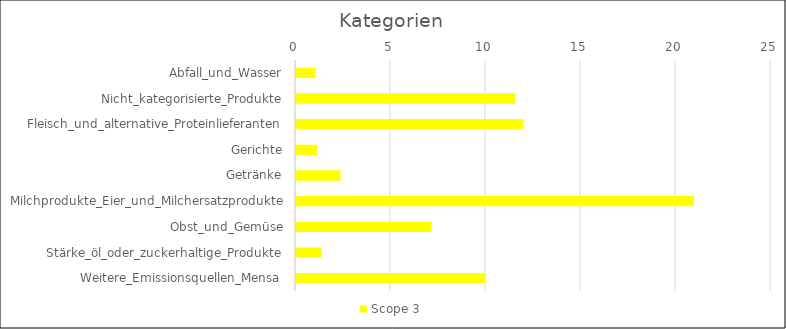
| Category | Scope 3 |
|---|---|
| Abfall_und_Wasser | 1.091 |
| Nicht_kategorisierte_Produkte | 11.6 |
| Fleisch_und_alternative_Proteinlieferanten | 12 |
| Gerichte | 1.16 |
| Getränke | 2.4 |
| Milchprodukte_Eier_und_Milchersatzprodukte | 21 |
| Obst_und_Gemüse | 7.2 |
| Stärke_öl_oder_zuckerhaltige_Produkte | 1.4 |
| Weitere_Emissionsquellen_Mensa | 10 |